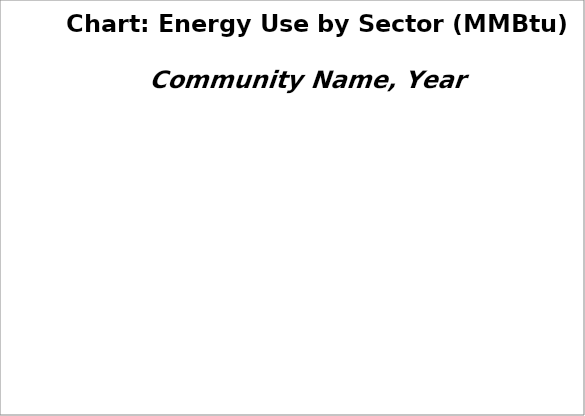
| Category | Series 0 |
|---|---|
| Commercial | 0 |
| Residential | 0 |
| Transportation | 0 |
| Industrial | 0 |